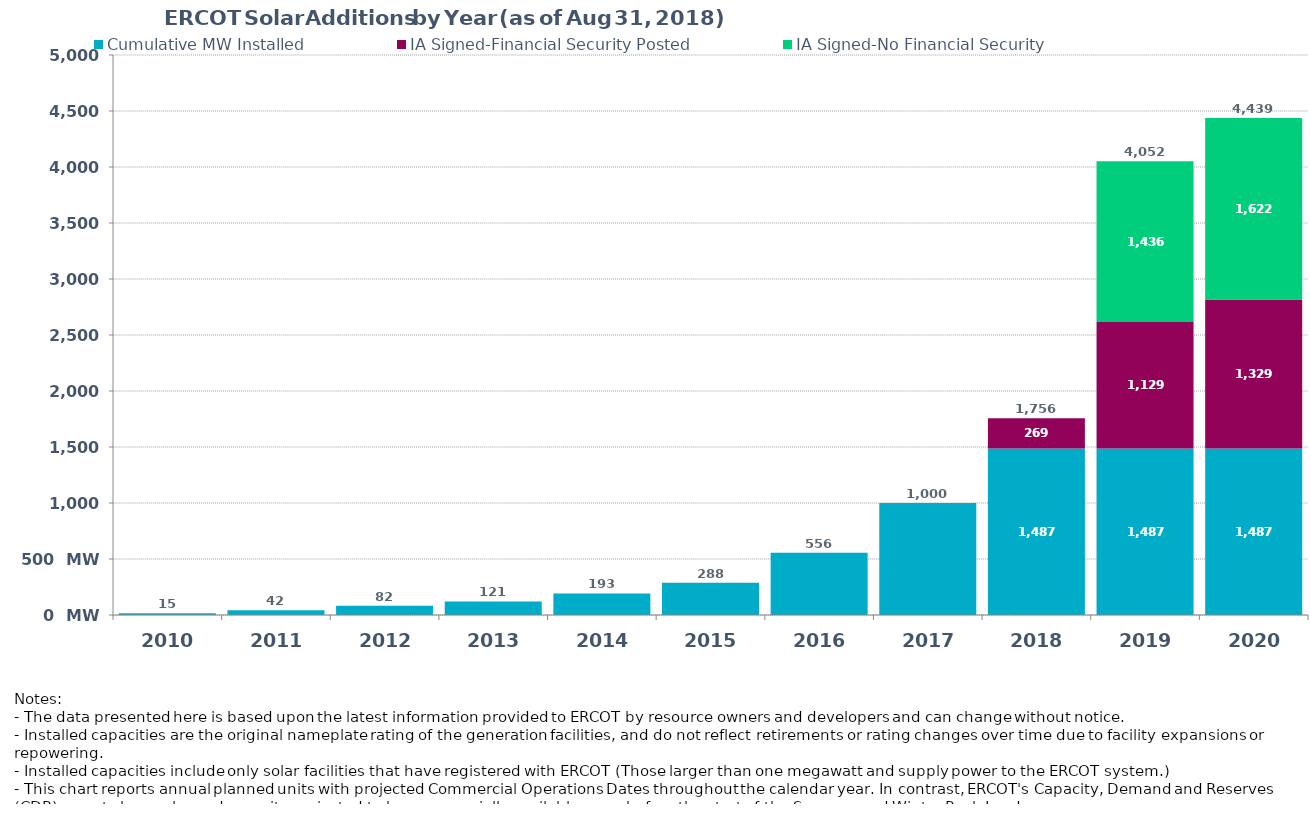
| Category | Cumulative MW Installed | IA Signed-Financial Security Posted  | IA Signed-No Financial Security  | Cumulative Installed and Planned |
|---|---|---|---|---|
| 2010.0 | 15 | 0 | 0 | 15 |
| 2011.0 | 42 | 0 | 0 | 42 |
| 2012.0 | 82 | 0 | 0 | 82 |
| 2013.0 | 121 | 0 | 0 | 121 |
| 2014.0 | 193 | 0 | 0 | 193 |
| 2015.0 | 287.7 | 0 | 0 | 287.7 |
| 2016.0 | 556 | 0 | 0 | 556 |
| 2017.0 | 1000 | 0 | 0 | 1000 |
| 2018.0 | 1487 | 269.4 | 0 | 1756.4 |
| 2019.0 | 1487 | 1129.4 | 1435.8 | 4052.2 |
| 2020.0 | 1487 | 1329.4 | 1622.1 | 4438.5 |